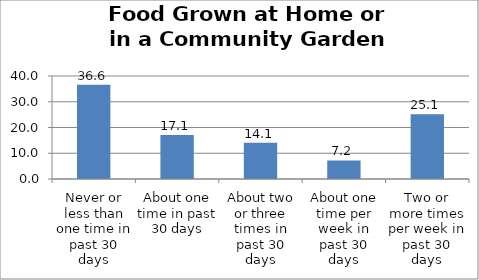
| Category | Series 0 |
|---|---|
| Never or less than one time in past 30 days | 36.562 |
| About one time in past 30 days | 17.084 |
| About two or three times in past 30 days | 14.06 |
| About one time per week in past 30 days | 7.186 |
| Two or more times per week in past 30 days | 25.108 |